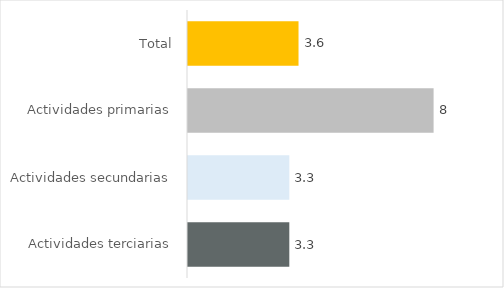
| Category | Series 0 |
|---|---|
| Actividades terciarias | 3.3 |
| Actividades secundarias | 3.3 |
| Actividades primarias | 8 |
| Total | 3.6 |